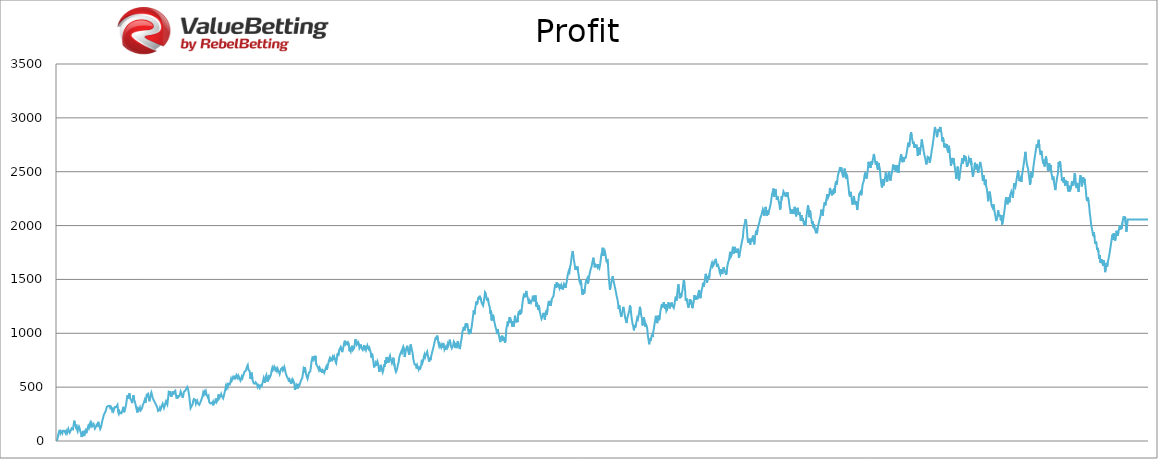
| Category | BackBets |
|---|---|
| 0 | 0 |
| 1 | 28.56 |
| 2 | 61.2 |
| 3 | 84.08 |
| 4 | 102.98 |
| 5 | 72.98 |
| 6 | 90.38 |
| 7 | 90.38 |
| 8 | 70.38 |
| 9 | 95.88 |
| 10 | 95.88 |
| 11 | 95.88 |
| 12 | 95.88 |
| 13 | 71.88 |
| 14 | 91.56 |
| 15 | 73.56 |
| 16 | 95.34 |
| 17 | 112.59 |
| 18 | 87.59 |
| 19 | 75.59 |
| 20 | 88.09 |
| 21 | 88.09 |
| 22 | 117.99 |
| 23 | 108.99 |
| 24 | 108.99 |
| 25 | 148.19 |
| 26 | 188.48 |
| 27 | 154.48 |
| 28 | 134.48 |
| 29 | 153.35 |
| 30 | 109.07 |
| 31 | 90.57 |
| 32 | 120.49 |
| 33 | 134.74 |
| 34 | 118.74 |
| 35 | 90.74 |
| 36 | 73.74 |
| 37 | 36.74 |
| 38 | 65.03 |
| 39 | 93.63 |
| 40 | 61.63 |
| 41 | 45.63 |
| 42 | 88.63 |
| 43 | 99.94 |
| 44 | 71.94 |
| 45 | 95.22 |
| 46 | 118.18 |
| 47 | 137.951 |
| 48 | 120.951 |
| 49 | 147.051 |
| 50 | 168.171 |
| 51 | 145.171 |
| 52 | 164.071 |
| 53 | 138.071 |
| 54 | 138.071 |
| 55 | 157.651 |
| 56 | 136.651 |
| 57 | 114.651 |
| 58 | 114.651 |
| 59 | 137.201 |
| 60 | 160.661 |
| 61 | 133.661 |
| 62 | 177.671 |
| 63 | 154.671 |
| 64 | 134.671 |
| 65 | 111.671 |
| 66 | 124.871 |
| 67 | 150.611 |
| 68 | 185.291 |
| 69 | 204.251 |
| 70 | 232.331 |
| 71 | 250.011 |
| 72 | 250.011 |
| 73 | 274.871 |
| 74 | 295.671 |
| 75 | 316.351 |
| 76 | 316.351 |
| 77 | 325.531 |
| 78 | 325.531 |
| 79 | 325.531 |
| 80 | 308.531 |
| 81 | 318.651 |
| 82 | 303.651 |
| 83 | 280.651 |
| 84 | 295.616 |
| 85 | 277.616 |
| 86 | 295.656 |
| 87 | 314.543 |
| 88 | 314.543 |
| 89 | 314.543 |
| 90 | 314.543 |
| 91 | 335.243 |
| 92 | 270.243 |
| 93 | 252.243 |
| 94 | 273.043 |
| 95 | 257.043 |
| 96 | 257.043 |
| 97 | 257.043 |
| 98 | 277.443 |
| 99 | 296.133 |
| 100 | 317.303 |
| 101 | 267.303 |
| 102 | 290.663 |
| 103 | 308.303 |
| 104 | 338.003 |
| 105 | 385.853 |
| 106 | 423.933 |
| 107 | 390.933 |
| 108 | 420.021 |
| 109 | 442.992 |
| 110 | 396.992 |
| 111 | 388.992 |
| 112 | 373.992 |
| 113 | 351.992 |
| 114 | 389.982 |
| 115 | 425.472 |
| 116 | 382.472 |
| 117 | 369.472 |
| 118 | 343.472 |
| 119 | 314.472 |
| 120 | 288.472 |
| 121 | 264.472 |
| 122 | 304.952 |
| 123 | 304.952 |
| 124 | 288.952 |
| 125 | 309.952 |
| 126 | 285.952 |
| 127 | 285.952 |
| 128 | 303.882 |
| 129 | 332.442 |
| 130 | 345.917 |
| 131 | 363.597 |
| 132 | 382.484 |
| 133 | 354.484 |
| 134 | 392.224 |
| 135 | 429.964 |
| 136 | 438.874 |
| 137 | 438.874 |
| 138 | 398.874 |
| 139 | 368.874 |
| 140 | 401.994 |
| 141 | 431.786 |
| 142 | 450.826 |
| 143 | 426.826 |
| 144 | 397.826 |
| 145 | 385.826 |
| 146 | 385.826 |
| 147 | 361.826 |
| 148 | 361.826 |
| 149 | 336.826 |
| 150 | 336.826 |
| 151 | 309.826 |
| 152 | 278.826 |
| 153 | 269.826 |
| 154 | 286.386 |
| 155 | 308.986 |
| 156 | 292.986 |
| 157 | 310.486 |
| 158 | 331.086 |
| 159 | 346.386 |
| 160 | 326.386 |
| 161 | 306.386 |
| 162 | 326.396 |
| 163 | 351.236 |
| 164 | 368.616 |
| 165 | 349.616 |
| 166 | 337.616 |
| 167 | 390.116 |
| 168 | 449.201 |
| 169 | 439.201 |
| 170 | 463.201 |
| 171 | 454.201 |
| 172 | 411.201 |
| 173 | 435.641 |
| 174 | 459.561 |
| 175 | 432.561 |
| 176 | 455.241 |
| 177 | 455.241 |
| 178 | 467.601 |
| 179 | 427.601 |
| 180 | 394.601 |
| 181 | 426.101 |
| 182 | 404.101 |
| 183 | 396.101 |
| 184 | 414.971 |
| 185 | 432.261 |
| 186 | 459.981 |
| 187 | 445.981 |
| 188 | 426.981 |
| 189 | 401.981 |
| 190 | 425.441 |
| 191 | 456.131 |
| 192 | 456.131 |
| 193 | 467.651 |
| 194 | 479.896 |
| 195 | 479.896 |
| 196 | 501.496 |
| 197 | 485.496 |
| 198 | 454.496 |
| 199 | 413.496 |
| 200 | 359.496 |
| 201 | 305.496 |
| 202 | 313.826 |
| 203 | 329.306 |
| 204 | 339.386 |
| 205 | 373.376 |
| 206 | 389.866 |
| 207 | 382.866 |
| 208 | 382.866 |
| 209 | 345.866 |
| 210 | 360.556 |
| 211 | 372.796 |
| 212 | 349.796 |
| 213 | 349.796 |
| 214 | 335.796 |
| 215 | 349.136 |
| 216 | 342.136 |
| 217 | 378.326 |
| 218 | 398.336 |
| 219 | 417.376 |
| 220 | 448.426 |
| 221 | 433.426 |
| 222 | 456.656 |
| 223 | 442.656 |
| 224 | 461.156 |
| 225 | 432.156 |
| 226 | 417.156 |
| 227 | 403.156 |
| 228 | 415.336 |
| 229 | 360.336 |
| 230 | 354.336 |
| 231 | 348.836 |
| 232 | 348.836 |
| 233 | 355.796 |
| 234 | 344.796 |
| 235 | 364.576 |
| 236 | 344.576 |
| 237 | 355.496 |
| 238 | 367.086 |
| 239 | 394.466 |
| 240 | 360.466 |
| 241 | 360.466 |
| 242 | 381.266 |
| 243 | 432.17 |
| 244 | 396.17 |
| 245 | 396.17 |
| 246 | 418.95 |
| 247 | 436.95 |
| 248 | 417.95 |
| 249 | 417.95 |
| 250 | 395.95 |
| 251 | 419.95 |
| 252 | 445.48 |
| 253 | 469.63 |
| 254 | 507.71 |
| 255 | 492.71 |
| 256 | 518.24 |
| 257 | 501.24 |
| 258 | 531.24 |
| 259 | 531.24 |
| 260 | 525.24 |
| 261 | 551.112 |
| 262 | 577.768 |
| 263 | 560.768 |
| 264 | 560.768 |
| 265 | 594.518 |
| 266 | 584.518 |
| 267 | 605.318 |
| 268 | 574.318 |
| 269 | 593.918 |
| 270 | 612.006 |
| 271 | 598.006 |
| 272 | 585.006 |
| 273 | 606.306 |
| 274 | 592.306 |
| 275 | 592.306 |
| 276 | 560.306 |
| 277 | 574.886 |
| 278 | 598.066 |
| 279 | 584.066 |
| 280 | 604.046 |
| 281 | 623.576 |
| 282 | 641.576 |
| 283 | 635.576 |
| 284 | 653.176 |
| 285 | 671.536 |
| 286 | 692.536 |
| 287 | 705.626 |
| 288 | 661.626 |
| 289 | 670.856 |
| 290 | 647.856 |
| 291 | 577.856 |
| 292 | 610.916 |
| 293 | 634.896 |
| 294 | 570.896 |
| 295 | 551.896 |
| 296 | 535.396 |
| 297 | 544.036 |
| 298 | 532.036 |
| 299 | 544.396 |
| 300 | 544.396 |
| 301 | 527.396 |
| 302 | 502.396 |
| 303 | 516.646 |
| 304 | 505.146 |
| 305 | 493.146 |
| 306 | 517.296 |
| 307 | 510.296 |
| 308 | 510.296 |
| 309 | 534.296 |
| 310 | 554.696 |
| 311 | 586.046 |
| 312 | 569.046 |
| 313 | 539.046 |
| 314 | 595.146 |
| 315 | 612.304 |
| 316 | 580.304 |
| 317 | 551.304 |
| 318 | 589.384 |
| 319 | 612.664 |
| 320 | 587.664 |
| 321 | 593.474 |
| 322 | 616.574 |
| 323 | 658.874 |
| 324 | 680.574 |
| 325 | 660.574 |
| 326 | 672.304 |
| 327 | 691.954 |
| 328 | 680.954 |
| 329 | 645.954 |
| 330 | 665.946 |
| 331 | 648.946 |
| 332 | 670.546 |
| 333 | 653.546 |
| 334 | 642.546 |
| 335 | 622.546 |
| 336 | 645.856 |
| 337 | 666.856 |
| 338 | 666.856 |
| 339 | 679.456 |
| 340 | 655.456 |
| 341 | 668.776 |
| 342 | 687.676 |
| 343 | 663.676 |
| 344 | 632.676 |
| 345 | 612.676 |
| 346 | 595.676 |
| 347 | 595.676 |
| 348 | 575.676 |
| 349 | 548.676 |
| 350 | 570.066 |
| 351 | 556.066 |
| 352 | 532.066 |
| 353 | 556.609 |
| 354 | 536.609 |
| 355 | 567.609 |
| 356 | 552.609 |
| 357 | 537.609 |
| 358 | 475.609 |
| 359 | 499.529 |
| 360 | 520.209 |
| 361 | 506.209 |
| 362 | 485.209 |
| 363 | 530.209 |
| 364 | 505.209 |
| 365 | 527.319 |
| 366 | 539.319 |
| 367 | 561.62 |
| 368 | 561.62 |
| 369 | 585.02 |
| 370 | 622.82 |
| 371 | 670.42 |
| 372 | 657.42 |
| 373 | 685.599 |
| 374 | 635.599 |
| 375 | 616.599 |
| 376 | 593.599 |
| 377 | 576.599 |
| 378 | 602.849 |
| 379 | 634.049 |
| 380 | 626.049 |
| 381 | 645.249 |
| 382 | 686.154 |
| 383 | 740.694 |
| 384 | 767.554 |
| 385 | 755.554 |
| 386 | 785.554 |
| 387 | 761.554 |
| 388 | 777.514 |
| 389 | 791.294 |
| 390 | 711.294 |
| 391 | 711.294 |
| 392 | 691.294 |
| 393 | 677.294 |
| 394 | 660.294 |
| 395 | 681.864 |
| 396 | 668.864 |
| 397 | 640.864 |
| 398 | 667.744 |
| 399 | 632.744 |
| 400 | 654.824 |
| 401 | 654.824 |
| 402 | 631.824 |
| 403 | 651.374 |
| 404 | 670.274 |
| 405 | 688.274 |
| 406 | 660.274 |
| 407 | 689.724 |
| 408 | 715.244 |
| 409 | 742.444 |
| 410 | 761.644 |
| 411 | 736.644 |
| 412 | 767.804 |
| 413 | 767.804 |
| 414 | 752.804 |
| 415 | 781.014 |
| 416 | 768.014 |
| 417 | 785.014 |
| 418 | 767.014 |
| 419 | 736.014 |
| 420 | 722.514 |
| 421 | 762.504 |
| 422 | 810.804 |
| 423 | 788.804 |
| 424 | 788.804 |
| 425 | 848.744 |
| 426 | 848.744 |
| 427 | 873.104 |
| 428 | 855.104 |
| 429 | 825.104 |
| 430 | 849.104 |
| 431 | 874.624 |
| 432 | 907.874 |
| 433 | 930.914 |
| 434 | 895.914 |
| 435 | 887.914 |
| 436 | 913.324 |
| 437 | 901.324 |
| 438 | 914.674 |
| 439 | 902.674 |
| 440 | 832.674 |
| 441 | 850.184 |
| 442 | 833.184 |
| 443 | 865.954 |
| 444 | 884.414 |
| 445 | 844.414 |
| 446 | 844.414 |
| 447 | 860.944 |
| 448 | 900.004 |
| 449 | 944.804 |
| 450 | 911.804 |
| 451 | 893.804 |
| 452 | 893.804 |
| 453 | 919.904 |
| 454 | 908.404 |
| 455 | 863.404 |
| 456 | 877.184 |
| 457 | 895.904 |
| 458 | 864.904 |
| 459 | 864.904 |
| 460 | 845.904 |
| 461 | 865.654 |
| 462 | 888.054 |
| 463 | 858.054 |
| 464 | 867.769 |
| 465 | 845.769 |
| 466 | 866.889 |
| 467 | 887.689 |
| 468 | 869.689 |
| 469 | 854.689 |
| 470 | 866.134 |
| 471 | 843.134 |
| 472 | 823.134 |
| 473 | 776.134 |
| 474 | 811.162 |
| 475 | 772.162 |
| 476 | 740.162 |
| 477 | 683.162 |
| 478 | 701.162 |
| 479 | 721.602 |
| 480 | 697.602 |
| 481 | 722.402 |
| 482 | 740.162 |
| 483 | 718.162 |
| 484 | 679.162 |
| 485 | 642.162 |
| 486 | 674.886 |
| 487 | 706.886 |
| 488 | 682.886 |
| 489 | 659.886 |
| 490 | 637.886 |
| 491 | 658.286 |
| 492 | 708.742 |
| 493 | 689.742 |
| 494 | 749.022 |
| 495 | 717.022 |
| 496 | 780.022 |
| 497 | 725.022 |
| 498 | 748.512 |
| 499 | 730.512 |
| 500 | 775.102 |
| 501 | 792.522 |
| 502 | 764.522 |
| 503 | 744.522 |
| 504 | 722.522 |
| 505 | 739.942 |
| 506 | 773.382 |
| 507 | 773.382 |
| 508 | 693.382 |
| 509 | 662.382 |
| 510 | 641.382 |
| 511 | 655.332 |
| 512 | 678.612 |
| 513 | 709.862 |
| 514 | 729.862 |
| 515 | 777.462 |
| 516 | 799.962 |
| 517 | 815.432 |
| 518 | 830.882 |
| 519 | 819.382 |
| 520 | 858.942 |
| 521 | 876.042 |
| 522 | 858.042 |
| 523 | 780.042 |
| 524 | 806.442 |
| 525 | 846.622 |
| 526 | 864.752 |
| 527 | 884.152 |
| 528 | 845.152 |
| 529 | 822.152 |
| 530 | 800.152 |
| 531 | 856.882 |
| 532 | 896.482 |
| 533 | 875.482 |
| 534 | 845.482 |
| 535 | 819.482 |
| 536 | 764.482 |
| 537 | 735.482 |
| 538 | 710.482 |
| 539 | 710.482 |
| 540 | 710.482 |
| 541 | 673.482 |
| 542 | 700.922 |
| 543 | 682.922 |
| 544 | 664.922 |
| 545 | 689.672 |
| 546 | 662.672 |
| 547 | 688.662 |
| 548 | 704.662 |
| 549 | 753.942 |
| 550 | 728.942 |
| 551 | 749.642 |
| 552 | 783.642 |
| 553 | 804.182 |
| 554 | 780.182 |
| 555 | 800.642 |
| 556 | 800.642 |
| 557 | 829.202 |
| 558 | 795.202 |
| 559 | 761.202 |
| 560 | 737.202 |
| 561 | 773.242 |
| 562 | 751.242 |
| 563 | 788.302 |
| 564 | 813.412 |
| 565 | 835.912 |
| 566 | 862.262 |
| 567 | 887.492 |
| 568 | 917.942 |
| 569 | 939.758 |
| 570 | 966.758 |
| 571 | 941.758 |
| 572 | 977.506 |
| 573 | 947.506 |
| 574 | 905.506 |
| 575 | 880.506 |
| 576 | 900.906 |
| 577 | 886.406 |
| 578 | 869.406 |
| 579 | 890.439 |
| 580 | 865.439 |
| 581 | 909.619 |
| 582 | 887.619 |
| 583 | 848.619 |
| 584 | 862.869 |
| 585 | 874.389 |
| 586 | 848.389 |
| 587 | 882.379 |
| 588 | 904.819 |
| 589 | 887.819 |
| 590 | 911.819 |
| 591 | 940.379 |
| 592 | 901.379 |
| 593 | 879.379 |
| 594 | 861.379 |
| 595 | 861.379 |
| 596 | 885.179 |
| 597 | 922.679 |
| 598 | 911.679 |
| 599 | 865.679 |
| 600 | 910.22 |
| 601 | 862.22 |
| 602 | 892.46 |
| 603 | 927.416 |
| 604 | 899.416 |
| 605 | 874.416 |
| 606 | 853.416 |
| 607 | 889.416 |
| 608 | 927.216 |
| 609 | 960.216 |
| 610 | 1012.136 |
| 611 | 1035.896 |
| 612 | 1059.386 |
| 613 | 1027.386 |
| 614 | 1066.026 |
| 615 | 1091.946 |
| 616 | 1055.946 |
| 617 | 1090.596 |
| 618 | 1053.596 |
| 619 | 1018.596 |
| 620 | 991.596 |
| 621 | 1037.496 |
| 622 | 997.496 |
| 623 | 1030.496 |
| 624 | 1062.176 |
| 625 | 1112.171 |
| 626 | 1162.166 |
| 627 | 1212.161 |
| 628 | 1176.161 |
| 629 | 1219.001 |
| 630 | 1259.321 |
| 631 | 1293.721 |
| 632 | 1267.721 |
| 633 | 1300.931 |
| 634 | 1333.915 |
| 635 | 1315.915 |
| 636 | 1347.735 |
| 637 | 1347.735 |
| 638 | 1308.735 |
| 639 | 1281.735 |
| 640 | 1281.735 |
| 641 | 1257.735 |
| 642 | 1288.083 |
| 643 | 1328.883 |
| 644 | 1380.483 |
| 645 | 1370.483 |
| 646 | 1333.483 |
| 647 | 1304.483 |
| 648 | 1329.053 |
| 649 | 1297.053 |
| 650 | 1262.053 |
| 651 | 1248.053 |
| 652 | 1182.053 |
| 653 | 1211.193 |
| 654 | 1118.693 |
| 655 | 1147.043 |
| 656 | 1172.393 |
| 657 | 1140.393 |
| 658 | 1108.393 |
| 659 | 1079.393 |
| 660 | 1054.393 |
| 661 | 1033.393 |
| 662 | 992.393 |
| 663 | 1039.193 |
| 664 | 1007.193 |
| 665 | 977.193 |
| 666 | 977.193 |
| 667 | 918.193 |
| 668 | 968.443 |
| 669 | 948.443 |
| 670 | 977.443 |
| 671 | 928.443 |
| 672 | 962.043 |
| 673 | 941.043 |
| 674 | 911.043 |
| 675 | 939.253 |
| 676 | 1041.003 |
| 677 | 1066.163 |
| 678 | 1109.663 |
| 679 | 1090.163 |
| 680 | 1115.683 |
| 681 | 1150.683 |
| 682 | 1095.683 |
| 683 | 1121.753 |
| 684 | 1102.753 |
| 685 | 1062.753 |
| 686 | 1110.753 |
| 687 | 1062.753 |
| 688 | 1098.443 |
| 689 | 1163.443 |
| 690 | 1137.443 |
| 691 | 1101.443 |
| 692 | 1126.743 |
| 693 | 1103.743 |
| 694 | 1178.143 |
| 695 | 1206.043 |
| 696 | 1171.043 |
| 697 | 1217.503 |
| 698 | 1179.503 |
| 699 | 1209.863 |
| 700 | 1261.093 |
| 701 | 1312.573 |
| 702 | 1345.473 |
| 703 | 1328.473 |
| 704 | 1367.523 |
| 705 | 1338.523 |
| 706 | 1393.273 |
| 707 | 1358.273 |
| 708 | 1334.273 |
| 709 | 1308.273 |
| 710 | 1272.273 |
| 711 | 1305.073 |
| 712 | 1305.073 |
| 713 | 1282.073 |
| 714 | 1282.073 |
| 715 | 1310.933 |
| 716 | 1348.763 |
| 717 | 1324.763 |
| 718 | 1295.763 |
| 719 | 1325.527 |
| 720 | 1352.497 |
| 721 | 1249.497 |
| 722 | 1288.697 |
| 723 | 1249.697 |
| 724 | 1218.697 |
| 725 | 1258.297 |
| 726 | 1213.297 |
| 727 | 1186.297 |
| 728 | 1186.297 |
| 729 | 1134.297 |
| 730 | 1134.297 |
| 731 | 1160.557 |
| 732 | 1189.997 |
| 733 | 1159.997 |
| 734 | 1126.997 |
| 735 | 1184.997 |
| 736 | 1210.377 |
| 737 | 1169.377 |
| 738 | 1228.027 |
| 739 | 1269.277 |
| 740 | 1300.477 |
| 741 | 1258.477 |
| 742 | 1284.667 |
| 743 | 1256.667 |
| 744 | 1306.662 |
| 745 | 1323.912 |
| 746 | 1323.912 |
| 747 | 1345.512 |
| 748 | 1390.512 |
| 749 | 1429.992 |
| 750 | 1457.512 |
| 751 | 1422.512 |
| 752 | 1472.392 |
| 753 | 1430.392 |
| 754 | 1461.742 |
| 755 | 1430.742 |
| 756 | 1416.742 |
| 757 | 1452.232 |
| 758 | 1413.232 |
| 759 | 1446.902 |
| 760 | 1430.902 |
| 761 | 1405.902 |
| 762 | 1432.542 |
| 763 | 1459.102 |
| 764 | 1449.102 |
| 765 | 1421.102 |
| 766 | 1450.802 |
| 767 | 1481.042 |
| 768 | 1527.102 |
| 769 | 1555.902 |
| 770 | 1579.422 |
| 771 | 1566.422 |
| 772 | 1617.062 |
| 773 | 1643.942 |
| 774 | 1693.446 |
| 775 | 1738.135 |
| 776 | 1762.581 |
| 777 | 1708.581 |
| 778 | 1670.581 |
| 779 | 1633.581 |
| 780 | 1589.581 |
| 781 | 1619.611 |
| 782 | 1590.611 |
| 783 | 1618.741 |
| 784 | 1567.741 |
| 785 | 1539.741 |
| 786 | 1484.741 |
| 787 | 1466.741 |
| 788 | 1491.741 |
| 789 | 1453.741 |
| 790 | 1373.741 |
| 791 | 1355.741 |
| 792 | 1407.491 |
| 793 | 1366.491 |
| 794 | 1397.431 |
| 795 | 1450.981 |
| 796 | 1486.981 |
| 797 | 1486.981 |
| 798 | 1510.981 |
| 799 | 1461.981 |
| 800 | 1513.491 |
| 801 | 1539.391 |
| 802 | 1569.651 |
| 803 | 1596.531 |
| 804 | 1611.906 |
| 805 | 1611.906 |
| 806 | 1672.356 |
| 807 | 1701.156 |
| 808 | 1653.156 |
| 809 | 1612.156 |
| 810 | 1639.756 |
| 811 | 1639.756 |
| 812 | 1626.756 |
| 813 | 1613.756 |
| 814 | 1641.806 |
| 815 | 1614.806 |
| 816 | 1602.806 |
| 817 | 1631.606 |
| 818 | 1678.874 |
| 819 | 1728.874 |
| 820 | 1753.234 |
| 821 | 1794.139 |
| 822 | 1719.139 |
| 823 | 1748.389 |
| 824 | 1765.809 |
| 825 | 1741.309 |
| 826 | 1697.309 |
| 827 | 1660.309 |
| 828 | 1690.199 |
| 829 | 1636.199 |
| 830 | 1536.199 |
| 831 | 1465.199 |
| 832 | 1404.199 |
| 833 | 1440.859 |
| 834 | 1469.719 |
| 835 | 1498.419 |
| 836 | 1529.579 |
| 837 | 1495.579 |
| 838 | 1469.079 |
| 839 | 1440.079 |
| 840 | 1412.079 |
| 841 | 1381.079 |
| 842 | 1346.079 |
| 843 | 1320.079 |
| 844 | 1289.079 |
| 845 | 1226.079 |
| 846 | 1258.939 |
| 847 | 1212.939 |
| 848 | 1176.939 |
| 849 | 1153.939 |
| 850 | 1183.579 |
| 851 | 1211.299 |
| 852 | 1245.139 |
| 853 | 1216.139 |
| 854 | 1179.139 |
| 855 | 1139.139 |
| 856 | 1119.139 |
| 857 | 1095.139 |
| 858 | 1143.899 |
| 859 | 1160.709 |
| 860 | 1185.069 |
| 861 | 1206.819 |
| 862 | 1258.119 |
| 863 | 1236.119 |
| 864 | 1173.119 |
| 865 | 1124.119 |
| 866 | 1089.119 |
| 867 | 1064.119 |
| 868 | 1027.119 |
| 869 | 1073.579 |
| 870 | 1053.579 |
| 871 | 1081.579 |
| 872 | 1112.579 |
| 873 | 1142.659 |
| 874 | 1129.659 |
| 875 | 1160.679 |
| 876 | 1195.519 |
| 877 | 1245.889 |
| 878 | 1212.889 |
| 879 | 1165.889 |
| 880 | 1141.889 |
| 881 | 1072.889 |
| 882 | 1122.566 |
| 883 | 1146.926 |
| 884 | 1115.926 |
| 885 | 1060.926 |
| 886 | 1085.076 |
| 887 | 1072.076 |
| 888 | 1044.076 |
| 889 | 980.076 |
| 890 | 942.076 |
| 891 | 898.076 |
| 892 | 950.016 |
| 893 | 929.016 |
| 894 | 954.936 |
| 895 | 988.056 |
| 896 | 965.056 |
| 897 | 1010.106 |
| 898 | 1039.866 |
| 899 | 1083.658 |
| 900 | 1117.978 |
| 901 | 1162.138 |
| 902 | 1127.138 |
| 903 | 1094.138 |
| 904 | 1131.938 |
| 905 | 1165.928 |
| 906 | 1121.928 |
| 907 | 1160.628 |
| 908 | 1210.778 |
| 909 | 1238.078 |
| 910 | 1272.078 |
| 911 | 1240.078 |
| 912 | 1264.498 |
| 913 | 1288.998 |
| 914 | 1247.998 |
| 915 | 1227.998 |
| 916 | 1269.578 |
| 917 | 1207.578 |
| 918 | 1220.118 |
| 919 | 1246.718 |
| 920 | 1287.182 |
| 921 | 1259.182 |
| 922 | 1231.182 |
| 923 | 1281.177 |
| 924 | 1250.177 |
| 925 | 1285.277 |
| 926 | 1257.277 |
| 927 | 1247.277 |
| 928 | 1235.277 |
| 929 | 1261.527 |
| 930 | 1311.522 |
| 931 | 1339.942 |
| 932 | 1303.942 |
| 933 | 1358.662 |
| 934 | 1414.042 |
| 935 | 1453.562 |
| 936 | 1377.562 |
| 937 | 1324.562 |
| 938 | 1374.557 |
| 939 | 1334.557 |
| 940 | 1371.637 |
| 941 | 1394.362 |
| 942 | 1444.357 |
| 943 | 1494.352 |
| 944 | 1466.352 |
| 945 | 1402.352 |
| 946 | 1299.352 |
| 947 | 1324.074 |
| 948 | 1293.074 |
| 949 | 1293.074 |
| 950 | 1238.074 |
| 951 | 1267.334 |
| 952 | 1315.184 |
| 953 | 1270.184 |
| 954 | 1309.964 |
| 955 | 1268.964 |
| 956 | 1232.964 |
| 957 | 1266.444 |
| 958 | 1289.764 |
| 959 | 1354.024 |
| 960 | 1314.024 |
| 961 | 1347.144 |
| 962 | 1314.144 |
| 963 | 1345.944 |
| 964 | 1317.944 |
| 965 | 1368.944 |
| 966 | 1401.844 |
| 967 | 1370.844 |
| 968 | 1325.844 |
| 969 | 1363.049 |
| 970 | 1400.649 |
| 971 | 1426.449 |
| 972 | 1469.009 |
| 973 | 1432.009 |
| 974 | 1461.149 |
| 975 | 1510.653 |
| 976 | 1552.053 |
| 977 | 1527.053 |
| 978 | 1467.053 |
| 979 | 1509.348 |
| 980 | 1533.148 |
| 981 | 1508.148 |
| 982 | 1558.143 |
| 983 | 1592.543 |
| 984 | 1618.353 |
| 985 | 1644.593 |
| 986 | 1626.593 |
| 987 | 1654.433 |
| 988 | 1635.433 |
| 989 | 1635.433 |
| 990 | 1663.273 |
| 991 | 1690.873 |
| 992 | 1657.873 |
| 993 | 1616.873 |
| 994 | 1644.537 |
| 995 | 1618.537 |
| 996 | 1607.537 |
| 997 | 1565.537 |
| 998 | 1551.037 |
| 999 | 1594.717 |
| 1000 | 1569.717 |
| 1001 | 1549.717 |
| 1002 | 1590.622 |
| 1003 | 1615.075 |
| 1004 | 1588.075 |
| 1005 | 1571.075 |
| 1006 | 1571.075 |
| 1007 | 1543.075 |
| 1008 | 1601.375 |
| 1009 | 1636.475 |
| 1010 | 1663.915 |
| 1011 | 1678.315 |
| 1012 | 1724.425 |
| 1013 | 1756.725 |
| 1014 | 1712.725 |
| 1015 | 1725.435 |
| 1016 | 1765.035 |
| 1017 | 1803.575 |
| 1018 | 1740.575 |
| 1019 | 1777.235 |
| 1020 | 1802.219 |
| 1021 | 1747.219 |
| 1022 | 1774.339 |
| 1023 | 1746.339 |
| 1024 | 1785.189 |
| 1025 | 1763.189 |
| 1026 | 1701.189 |
| 1027 | 1730.419 |
| 1028 | 1764.739 |
| 1029 | 1804.299 |
| 1030 | 1832.459 |
| 1031 | 1864.459 |
| 1032 | 1892.359 |
| 1033 | 1968.019 |
| 1034 | 1999.019 |
| 1035 | 2026.794 |
| 1036 | 2059.194 |
| 1037 | 2034.194 |
| 1038 | 1963.194 |
| 1039 | 1874.194 |
| 1040 | 1840.194 |
| 1041 | 1877.394 |
| 1042 | 1852.394 |
| 1043 | 1823.394 |
| 1044 | 1878.594 |
| 1045 | 1851.594 |
| 1046 | 1878.054 |
| 1047 | 1906.764 |
| 1048 | 1867.764 |
| 1049 | 1825.764 |
| 1050 | 1887.264 |
| 1051 | 1919.944 |
| 1052 | 1951.944 |
| 1053 | 1915.944 |
| 1054 | 1964.244 |
| 1055 | 1991.908 |
| 1056 | 2011.888 |
| 1057 | 2037.315 |
| 1058 | 2066.201 |
| 1059 | 2066.201 |
| 1060 | 2100.041 |
| 1061 | 2126.441 |
| 1062 | 2151.881 |
| 1063 | 2134.881 |
| 1064 | 2091.881 |
| 1065 | 2116.241 |
| 1066 | 2173.741 |
| 1067 | 2140.741 |
| 1068 | 2090.741 |
| 1069 | 2138.791 |
| 1070 | 2100.791 |
| 1071 | 2137.641 |
| 1072 | 2151.56 |
| 1073 | 2180.16 |
| 1074 | 2206.89 |
| 1075 | 2256.885 |
| 1076 | 2293.405 |
| 1077 | 2293.405 |
| 1078 | 2343.4 |
| 1079 | 2267.4 |
| 1080 | 2310.69 |
| 1081 | 2339.92 |
| 1082 | 2288.92 |
| 1083 | 2237.92 |
| 1084 | 2270.48 |
| 1085 | 2247.48 |
| 1086 | 2221.48 |
| 1087 | 2192.48 |
| 1088 | 2148.48 |
| 1089 | 2183.592 |
| 1090 | 2271.592 |
| 1091 | 2257.092 |
| 1092 | 2282.712 |
| 1093 | 2317.712 |
| 1094 | 2317.712 |
| 1095 | 2294.712 |
| 1096 | 2271.712 |
| 1097 | 2304.112 |
| 1098 | 2265.112 |
| 1099 | 2308.232 |
| 1100 | 2271.232 |
| 1101 | 2238.232 |
| 1102 | 2185.232 |
| 1103 | 2150.232 |
| 1104 | 2110.232 |
| 1105 | 2148.312 |
| 1106 | 2119.312 |
| 1107 | 2146.042 |
| 1108 | 2107.042 |
| 1109 | 2149.162 |
| 1110 | 2174.362 |
| 1111 | 2136.362 |
| 1112 | 2085.362 |
| 1113 | 2120.462 |
| 1114 | 2165.012 |
| 1115 | 2144.012 |
| 1116 | 2100.012 |
| 1117 | 2125.532 |
| 1118 | 2093.532 |
| 1119 | 2046.532 |
| 1120 | 2097.247 |
| 1121 | 2042.247 |
| 1122 | 2068.887 |
| 1123 | 2040.887 |
| 1124 | 2008.887 |
| 1125 | 2039.047 |
| 1126 | 1999.047 |
| 1127 | 2055.405 |
| 1128 | 2102.705 |
| 1129 | 2149.625 |
| 1130 | 2187.803 |
| 1131 | 2132.803 |
| 1132 | 2077.803 |
| 1133 | 2141.703 |
| 1134 | 2086.703 |
| 1135 | 2061.703 |
| 1136 | 2012.703 |
| 1137 | 2038.953 |
| 1138 | 1983.953 |
| 1139 | 2014.893 |
| 1140 | 1966.893 |
| 1141 | 1956.893 |
| 1142 | 1928.893 |
| 1143 | 1958.533 |
| 1144 | 1947.533 |
| 1145 | 1994.143 |
| 1146 | 1994.143 |
| 1147 | 2046.013 |
| 1148 | 2046.013 |
| 1149 | 2097.713 |
| 1150 | 2147.933 |
| 1151 | 2132.933 |
| 1152 | 2091.933 |
| 1153 | 2143.233 |
| 1154 | 2186.663 |
| 1155 | 2216.583 |
| 1156 | 2187.583 |
| 1157 | 2227.543 |
| 1158 | 2258.263 |
| 1159 | 2291.923 |
| 1160 | 2256.923 |
| 1161 | 2256.923 |
| 1162 | 2288.513 |
| 1163 | 2349.613 |
| 1164 | 2318.613 |
| 1165 | 2318.613 |
| 1166 | 2280.613 |
| 1167 | 2325.263 |
| 1168 | 2291.263 |
| 1169 | 2344.543 |
| 1170 | 2302.543 |
| 1171 | 2373.093 |
| 1172 | 2413.693 |
| 1173 | 2380.693 |
| 1174 | 2417.233 |
| 1175 | 2468.233 |
| 1176 | 2468.233 |
| 1177 | 2507.713 |
| 1178 | 2540.513 |
| 1179 | 2506.513 |
| 1180 | 2539.273 |
| 1181 | 2500.273 |
| 1182 | 2469.273 |
| 1183 | 2448.273 |
| 1184 | 2481.873 |
| 1185 | 2528.743 |
| 1186 | 2482.743 |
| 1187 | 2436.743 |
| 1188 | 2474.343 |
| 1189 | 2462.343 |
| 1190 | 2397.343 |
| 1191 | 2357.343 |
| 1192 | 2288.343 |
| 1193 | 2269.343 |
| 1194 | 2313.023 |
| 1195 | 2279.023 |
| 1196 | 2229.023 |
| 1197 | 2194.023 |
| 1198 | 2246.313 |
| 1199 | 2274.523 |
| 1200 | 2217.523 |
| 1201 | 2197.023 |
| 1202 | 2227.093 |
| 1203 | 2194.093 |
| 1204 | 2144.093 |
| 1205 | 2204.093 |
| 1206 | 2239.343 |
| 1207 | 2294.383 |
| 1208 | 2294.383 |
| 1209 | 2314.483 |
| 1210 | 2281.483 |
| 1211 | 2315.023 |
| 1212 | 2379.023 |
| 1213 | 2379.023 |
| 1214 | 2416.863 |
| 1215 | 2464.363 |
| 1216 | 2492.743 |
| 1217 | 2460.743 |
| 1218 | 2435.743 |
| 1219 | 2470.843 |
| 1220 | 2526.303 |
| 1221 | 2591.963 |
| 1222 | 2548.963 |
| 1223 | 2581.163 |
| 1224 | 2536.163 |
| 1225 | 2595.313 |
| 1226 | 2563.313 |
| 1227 | 2596.483 |
| 1228 | 2628.193 |
| 1229 | 2664.913 |
| 1230 | 2631.913 |
| 1231 | 2593.913 |
| 1232 | 2562.913 |
| 1233 | 2599.163 |
| 1234 | 2544.163 |
| 1235 | 2518.163 |
| 1236 | 2581.863 |
| 1237 | 2553.863 |
| 1238 | 2526.863 |
| 1239 | 2452.863 |
| 1240 | 2399.863 |
| 1241 | 2353.863 |
| 1242 | 2369.443 |
| 1243 | 2431.663 |
| 1244 | 2373.663 |
| 1245 | 2420.143 |
| 1246 | 2445.213 |
| 1247 | 2492.813 |
| 1248 | 2440.813 |
| 1249 | 2406.813 |
| 1250 | 2447.553 |
| 1251 | 2480.993 |
| 1252 | 2501.393 |
| 1253 | 2437.393 |
| 1254 | 2416.893 |
| 1255 | 2453.993 |
| 1256 | 2486.193 |
| 1257 | 2519.633 |
| 1258 | 2565.783 |
| 1259 | 2535.783 |
| 1260 | 2517.783 |
| 1261 | 2561.133 |
| 1262 | 2497.133 |
| 1263 | 2529.533 |
| 1264 | 2562.093 |
| 1265 | 2529.093 |
| 1266 | 2488.093 |
| 1267 | 2560.033 |
| 1268 | 2595.223 |
| 1269 | 2629.423 |
| 1270 | 2662.103 |
| 1271 | 2624.103 |
| 1272 | 2588.103 |
| 1273 | 2631.223 |
| 1274 | 2592.223 |
| 1275 | 2630.063 |
| 1276 | 2630.063 |
| 1277 | 2630.063 |
| 1278 | 2661.343 |
| 1279 | 2697.823 |
| 1280 | 2737.603 |
| 1281 | 2770.003 |
| 1282 | 2729.003 |
| 1283 | 2769.503 |
| 1284 | 2837.333 |
| 1285 | 2867.693 |
| 1286 | 2828.693 |
| 1287 | 2828.693 |
| 1288 | 2756.693 |
| 1289 | 2776.673 |
| 1290 | 2724.673 |
| 1291 | 2754.193 |
| 1292 | 2721.193 |
| 1293 | 2750.433 |
| 1294 | 2711.433 |
| 1295 | 2646.433 |
| 1296 | 2688.233 |
| 1297 | 2724.113 |
| 1298 | 2660.113 |
| 1299 | 2705.873 |
| 1300 | 2737.223 |
| 1301 | 2799.223 |
| 1302 | 2765.223 |
| 1303 | 2735.223 |
| 1304 | 2689.223 |
| 1305 | 2657.223 |
| 1306 | 2630.223 |
| 1307 | 2602.223 |
| 1308 | 2568.223 |
| 1309 | 2601.823 |
| 1310 | 2638.483 |
| 1311 | 2638.483 |
| 1312 | 2630.483 |
| 1313 | 2584.483 |
| 1314 | 2611.923 |
| 1315 | 2644.223 |
| 1316 | 2694.218 |
| 1317 | 2726.618 |
| 1318 | 2772.058 |
| 1319 | 2812.978 |
| 1320 | 2873.878 |
| 1321 | 2915.608 |
| 1322 | 2878.608 |
| 1323 | 2863.608 |
| 1324 | 2820.608 |
| 1325 | 2856.798 |
| 1326 | 2896.578 |
| 1327 | 2868.578 |
| 1328 | 2868.578 |
| 1329 | 2915.618 |
| 1330 | 2882.618 |
| 1331 | 2845.618 |
| 1332 | 2781.618 |
| 1333 | 2819.688 |
| 1334 | 2783.688 |
| 1335 | 2725.688 |
| 1336 | 2725.688 |
| 1337 | 2759.228 |
| 1338 | 2721.228 |
| 1339 | 2753.795 |
| 1340 | 2698.795 |
| 1341 | 2678.295 |
| 1342 | 2740.375 |
| 1343 | 2676.375 |
| 1344 | 2615.375 |
| 1345 | 2554.375 |
| 1346 | 2586.875 |
| 1347 | 2628.275 |
| 1348 | 2584.275 |
| 1349 | 2623.215 |
| 1350 | 2572.215 |
| 1351 | 2534.215 |
| 1352 | 2496.215 |
| 1353 | 2432.215 |
| 1354 | 2480.547 |
| 1355 | 2547.777 |
| 1356 | 2486.777 |
| 1357 | 2419.777 |
| 1358 | 2454.427 |
| 1359 | 2502.397 |
| 1360 | 2549.757 |
| 1361 | 2581.917 |
| 1362 | 2623.077 |
| 1363 | 2577.077 |
| 1364 | 2611.477 |
| 1365 | 2652.877 |
| 1366 | 2599.877 |
| 1367 | 2640.197 |
| 1368 | 2600.197 |
| 1369 | 2545.197 |
| 1370 | 2545.197 |
| 1371 | 2579.597 |
| 1372 | 2625.387 |
| 1373 | 2610.387 |
| 1374 | 2593.387 |
| 1375 | 2625.067 |
| 1376 | 2562.067 |
| 1377 | 2498.067 |
| 1378 | 2453.067 |
| 1379 | 2490.807 |
| 1380 | 2523.867 |
| 1381 | 2583.387 |
| 1382 | 2551.387 |
| 1383 | 2522.387 |
| 1384 | 2572.382 |
| 1385 | 2520.382 |
| 1386 | 2490.382 |
| 1387 | 2532.502 |
| 1388 | 2532.502 |
| 1389 | 2590.802 |
| 1390 | 2553.802 |
| 1391 | 2534.802 |
| 1392 | 2470.802 |
| 1393 | 2415.802 |
| 1394 | 2465.323 |
| 1395 | 2414.323 |
| 1396 | 2375.323 |
| 1397 | 2426.523 |
| 1398 | 2366.523 |
| 1399 | 2339.023 |
| 1400 | 2295.023 |
| 1401 | 2226.023 |
| 1402 | 2265.783 |
| 1403 | 2315.463 |
| 1404 | 2290.463 |
| 1405 | 2252.463 |
| 1406 | 2188.463 |
| 1407 | 2188.463 |
| 1408 | 2161.463 |
| 1409 | 2196.423 |
| 1410 | 2158.423 |
| 1411 | 2117.423 |
| 1412 | 2087.923 |
| 1413 | 2041.923 |
| 1414 | 2041.923 |
| 1415 | 2085.663 |
| 1416 | 2142.603 |
| 1417 | 2094.603 |
| 1418 | 2094.603 |
| 1419 | 2094.603 |
| 1420 | 2049.603 |
| 1421 | 2098.053 |
| 1422 | 2011.053 |
| 1423 | 2036.653 |
| 1424 | 2071.213 |
| 1425 | 2116.013 |
| 1426 | 2161.913 |
| 1427 | 2226.173 |
| 1428 | 2263.413 |
| 1429 | 2246.913 |
| 1430 | 2196.913 |
| 1431 | 2232.793 |
| 1432 | 2264.473 |
| 1433 | 2216.473 |
| 1434 | 2280.873 |
| 1435 | 2280.873 |
| 1436 | 2318.673 |
| 1437 | 2300.673 |
| 1438 | 2259.673 |
| 1439 | 2314.923 |
| 1440 | 2392.623 |
| 1441 | 2392.623 |
| 1442 | 2359.623 |
| 1443 | 2394.423 |
| 1444 | 2438.423 |
| 1445 | 2475.383 |
| 1446 | 2510.363 |
| 1447 | 2459.363 |
| 1448 | 2412.363 |
| 1449 | 2412.363 |
| 1450 | 2442.743 |
| 1451 | 2404.743 |
| 1452 | 2467.923 |
| 1453 | 2507.083 |
| 1454 | 2548.483 |
| 1455 | 2590.823 |
| 1456 | 2638.423 |
| 1457 | 2684.323 |
| 1458 | 2627.323 |
| 1459 | 2580.323 |
| 1460 | 2550.323 |
| 1461 | 2530.323 |
| 1462 | 2530.323 |
| 1463 | 2434.323 |
| 1464 | 2377.323 |
| 1465 | 2418.733 |
| 1466 | 2498.533 |
| 1467 | 2443.533 |
| 1468 | 2483.493 |
| 1469 | 2541.093 |
| 1470 | 2586.973 |
| 1471 | 2630.093 |
| 1472 | 2671.493 |
| 1473 | 2706.593 |
| 1474 | 2752.793 |
| 1475 | 2720.793 |
| 1476 | 2756.133 |
| 1477 | 2796.433 |
| 1478 | 2740.433 |
| 1479 | 2688.433 |
| 1480 | 2655.433 |
| 1481 | 2693.653 |
| 1482 | 2652.653 |
| 1483 | 2601.653 |
| 1484 | 2573.653 |
| 1485 | 2611.093 |
| 1486 | 2549.093 |
| 1487 | 2602.853 |
| 1488 | 2641.273 |
| 1489 | 2600.273 |
| 1490 | 2562.273 |
| 1491 | 2506.273 |
| 1492 | 2541.923 |
| 1493 | 2576.903 |
| 1494 | 2512.903 |
| 1495 | 2559.903 |
| 1496 | 2495.903 |
| 1497 | 2495.903 |
| 1498 | 2426.903 |
| 1499 | 2454.278 |
| 1500 | 2403.278 |
| 1501 | 2403.278 |
| 1502 | 2329.278 |
| 1503 | 2378.778 |
| 1504 | 2415.738 |
| 1505 | 2453.178 |
| 1506 | 2484.118 |
| 1507 | 2587.718 |
| 1508 | 2542.718 |
| 1509 | 2598.228 |
| 1510 | 2548.228 |
| 1511 | 2500.228 |
| 1512 | 2413.228 |
| 1513 | 2439.418 |
| 1514 | 2402.418 |
| 1515 | 2446.638 |
| 1516 | 2396.638 |
| 1517 | 2369.638 |
| 1518 | 2416.788 |
| 1519 | 2388.788 |
| 1520 | 2413.778 |
| 1521 | 2339.778 |
| 1522 | 2315.778 |
| 1523 | 2369.358 |
| 1524 | 2318.358 |
| 1525 | 2318.358 |
| 1526 | 2366.148 |
| 1527 | 2411.228 |
| 1528 | 2411.228 |
| 1529 | 2372.228 |
| 1530 | 2409.668 |
| 1531 | 2484.868 |
| 1532 | 2464.868 |
| 1533 | 2376.868 |
| 1534 | 2347.868 |
| 1535 | 2396.008 |
| 1536 | 2360.008 |
| 1537 | 2313.008 |
| 1538 | 2367.908 |
| 1539 | 2431.348 |
| 1540 | 2466.838 |
| 1541 | 2402.838 |
| 1542 | 2363.838 |
| 1543 | 2407.188 |
| 1544 | 2449.078 |
| 1545 | 2396.078 |
| 1546 | 2434.158 |
| 1547 | 2377.158 |
| 1548 | 2328.158 |
| 1549 | 2248.158 |
| 1550 | 2227.658 |
| 1551 | 2264.058 |
| 1552 | 2225.058 |
| 1553 | 2179.058 |
| 1554 | 2109.058 |
| 1555 | 2067.058 |
| 1556 | 2006.058 |
| 1557 | 1974.058 |
| 1558 | 1942.058 |
| 1559 | 1903.058 |
| 1560 | 1937.378 |
| 1561 | 1891.378 |
| 1562 | 1831.378 |
| 1563 | 1855.738 |
| 1564 | 1827.738 |
| 1565 | 1772.738 |
| 1566 | 1792.478 |
| 1567 | 1754.478 |
| 1568 | 1690.478 |
| 1569 | 1723.238 |
| 1570 | 1652.238 |
| 1571 | 1652.238 |
| 1572 | 1685.778 |
| 1573 | 1649.778 |
| 1574 | 1624.778 |
| 1575 | 1677.558 |
| 1576 | 1638.558 |
| 1577 | 1567.558 |
| 1578 | 1605.398 |
| 1579 | 1651.298 |
| 1580 | 1618.298 |
| 1581 | 1664.498 |
| 1582 | 1687.298 |
| 1583 | 1720.298 |
| 1584 | 1757.918 |
| 1585 | 1794.408 |
| 1586 | 1837.408 |
| 1587 | 1878.448 |
| 1588 | 1916.288 |
| 1589 | 1866.288 |
| 1590 | 1930.308 |
| 1591 | 1891.308 |
| 1592 | 1859.308 |
| 1593 | 1888.758 |
| 1594 | 1951.646 |
| 1595 | 1936.646 |
| 1596 | 1905.646 |
| 1597 | 1940.476 |
| 1598 | 1970.926 |
| 1599 | 2002.516 |
| 1600 | 1963.516 |
| 1601 | 1999.776 |
| 1602 | 1972.776 |
| 1603 | 2029.476 |
| 1604 | 2061.296 |
| 1605 | 2085.046 |
| 1606 | 2050.046 |
| 1607 | 2081.726 |
| 1608 | 2016.726 |
| 1609 | 1942.726 |
| 1610 | 1998.406 |
| 1611 | 2055.406 |
| 1612 | 2055.406 |
| 1613 | 2055.406 |
| 1614 | 2055.406 |
| 1615 | 2055.406 |
| 1616 | 2055.406 |
| 1617 | 2055.406 |
| 1618 | 2055.406 |
| 1619 | 2055.406 |
| 1620 | 2055.406 |
| 1621 | 2055.406 |
| 1622 | 2055.406 |
| 1623 | 2055.406 |
| 1624 | 2055.406 |
| 1625 | 2055.406 |
| 1626 | 2055.406 |
| 1627 | 2055.406 |
| 1628 | 2055.406 |
| 1629 | 2055.406 |
| 1630 | 2055.406 |
| 1631 | 2055.406 |
| 1632 | 2055.406 |
| 1633 | 2055.406 |
| 1634 | 2055.406 |
| 1635 | 2055.406 |
| 1636 | 2055.406 |
| 1637 | 2055.406 |
| 1638 | 2055.406 |
| 1639 | 2055.406 |
| 1640 | 2055.406 |
| 1641 | 2055.406 |
| 1642 | 2055.406 |
| 1643 | 2055.406 |